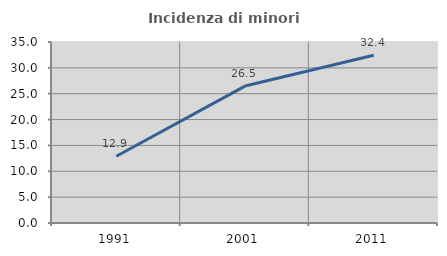
| Category | Incidenza di minori stranieri |
|---|---|
| 1991.0 | 12.903 |
| 2001.0 | 26.477 |
| 2011.0 | 32.424 |